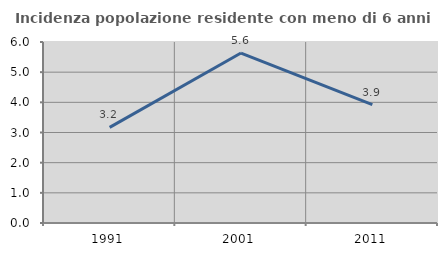
| Category | Incidenza popolazione residente con meno di 6 anni |
|---|---|
| 1991.0 | 3.168 |
| 2001.0 | 5.634 |
| 2011.0 | 3.922 |